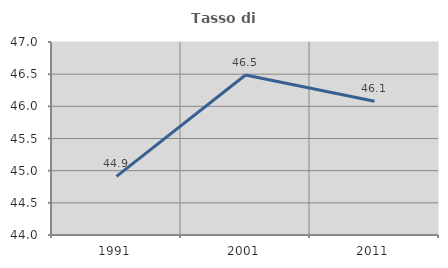
| Category | Tasso di occupazione   |
|---|---|
| 1991.0 | 44.912 |
| 2001.0 | 46.486 |
| 2011.0 | 46.078 |